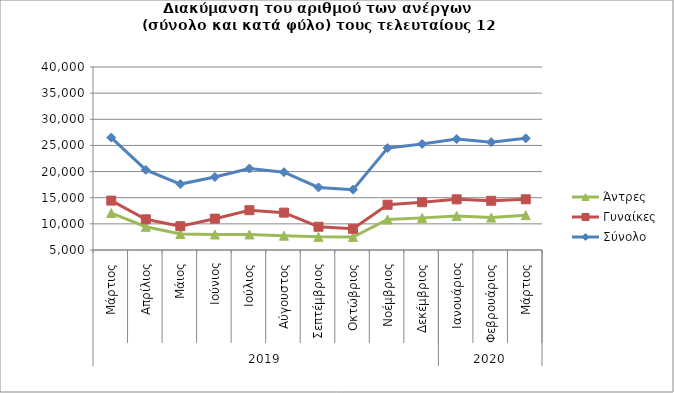
| Category | Άντρες | Γυναίκες | Σύνολο |
|---|---|---|---|
| 0 | 12061 | 14447 | 26508 |
| 1 | 9443 | 10872 | 20315 |
| 2 | 8053 | 9554 | 17607 |
| 3 | 7968 | 10992 | 18960 |
| 4 | 7975 | 12607 | 20582 |
| 5 | 7739 | 12144 | 19883 |
| 6 | 7518 | 9450 | 16968 |
| 7 | 7491 | 9053 | 16544 |
| 8 | 10842 | 13653 | 24495 |
| 9 | 11144 | 14141 | 25285 |
| 10 | 11522 | 14692 | 26214 |
| 11 | 11203 | 14417 | 25620 |
| 12 | 11658 | 14695 | 26353 |